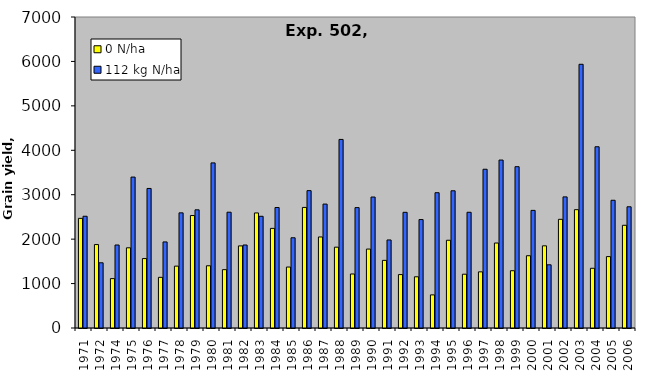
| Category | 0 N/ha | 112 kg N/ha |
|---|---|---|
| 1971.0 | 2467.92 | 2514.96 |
| 1972.0 | 1878.24 | 1467.648 |
| 1974.0 | 1111.942 | 1868.143 |
| 1975.0 | 1805.126 | 3396.809 |
| 1976.0 | 1563.223 | 3140.676 |
| 1977.0 | 1140.401 | 1937.258 |
| 1978.0 | 1392.468 | 2591.82 |
| 1979.0 | 2531.76 | 2659.944 |
| 1980.0 | 1400.616 | 3715.992 |
| 1981.0 | 1313.256 | 2606.184 |
| 1982.0 | 1847.832 | 1868.16 |
| 1983.0 | 2589.72 | 2514.456 |
| 1984.0 | 2242.128 | 2711.52 |
| 1985.0 | 1372.056 | 2030.784 |
| 1986.0 | 2713.704 | 3091.872 |
| 1987.0 | 2049.096 | 2788.968 |
| 1988.0 | 1819.272 | 4244.352 |
| 1989.0 | 1215.648 | 2709.672 |
| 1990.0 | 1776.6 | 2947.56 |
| 1991.0 | 1522.416 | 1981.728 |
| 1992.0 | 1202.198 | 2603.814 |
| 1993.0 | 1152.598 | 2440.58 |
| 1994.0 | 745.428 | 3045.134 |
| 1995.0 | 1974.761 | 3088.265 |
| 1996.0 | 1210.518 | 2604.867 |
| 1997.0 | 1263.879 | 3572.865 |
| 1998.0 | 1912.766 | 3780.124 |
| 1999.0 | 1289.191 | 3630.612 |
| 2000.0 | 1626.686 | 2647.469 |
| 2001.0 | 1849.491 | 1422.245 |
| 2002.0 | 2445.992 | 2951.129 |
| 2003.0 | 2663.402 | 5935.714 |
| 2004.0 | 1344 | 4079.04 |
| 2005.0 | 1607.207 | 2874.786 |
| 2006.0 | 2311.68 | 2728.32 |